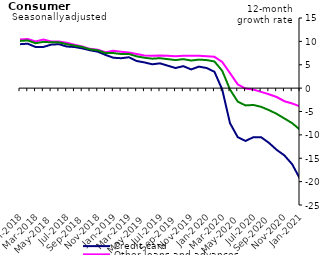
| Category | Credit card | Other loans and advances | Total |
|---|---|---|---|
| Jan-2018 | 9.4 | 10.4 | 10.1 |
| Feb-2018 | 9.5 | 10.5 | 10.2 |
| Mar-2018 | 8.8 | 10 | 9.6 |
| Apr-2018 | 8.8 | 10.4 | 9.9 |
| May-2018 | 9.3 | 10 | 9.8 |
| Jun-2018 | 9.4 | 10 | 9.8 |
| Jul-2018 | 8.9 | 9.7 | 9.4 |
| Aug-2018 | 8.8 | 9.3 | 9.1 |
| Sep-2018 | 8.5 | 8.9 | 8.8 |
| Oct-2018 | 8.1 | 8.4 | 8.3 |
| Nov-2018 | 7.8 | 8.2 | 8.1 |
| Dec-2018 | 7.1 | 7.7 | 7.5 |
| Jan-2019 | 6.5 | 8 | 7.5 |
| Feb-2019 | 6.4 | 7.8 | 7.3 |
| Mar-2019 | 6.6 | 7.6 | 7.3 |
| Apr-2019 | 5.8 | 7.3 | 6.8 |
| May-2019 | 5.5 | 7 | 6.5 |
| Jun-2019 | 5.1 | 6.9 | 6.3 |
| Jul-2019 | 5.3 | 7 | 6.4 |
| Aug-2019 | 4.8 | 6.9 | 6.2 |
| Sep-2019 | 4.3 | 6.8 | 6 |
| Oct-2019 | 4.7 | 6.9 | 6.2 |
| Nov-2019 | 4 | 6.9 | 5.9 |
| Dec-2019 | 4.6 | 6.9 | 6.1 |
| Jan-2020 | 4.3 | 6.8 | 6 |
| Feb-2020 | 3.5 | 6.7 | 5.7 |
| Mar-2020 | -0.3 | 5.6 | 3.7 |
| Apr-2020 | -7.5 | 3.2 | -0.3 |
| May-2020 | -10.5 | 0.8 | -2.9 |
| Jun-2020 | -11.3 | -0.1 | -3.7 |
| Jul-2020 | -10.5 | -0.3 | -3.6 |
| Aug-2020 | -10.5 | -0.8 | -4 |
| Sep-2020 | -11.7 | -1.3 | -4.7 |
| Oct-2020 | -13.2 | -1.9 | -5.5 |
| Nov-2020 | -14.4 | -2.8 | -6.5 |
| Dec-2020 | -16.3 | -3.3 | -7.5 |
| Jan-2021 | -19.4 | -3.9 | -8.9 |